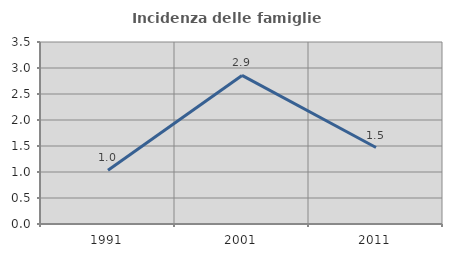
| Category | Incidenza delle famiglie numerose |
|---|---|
| 1991.0 | 1.034 |
| 2001.0 | 2.857 |
| 2011.0 | 1.471 |